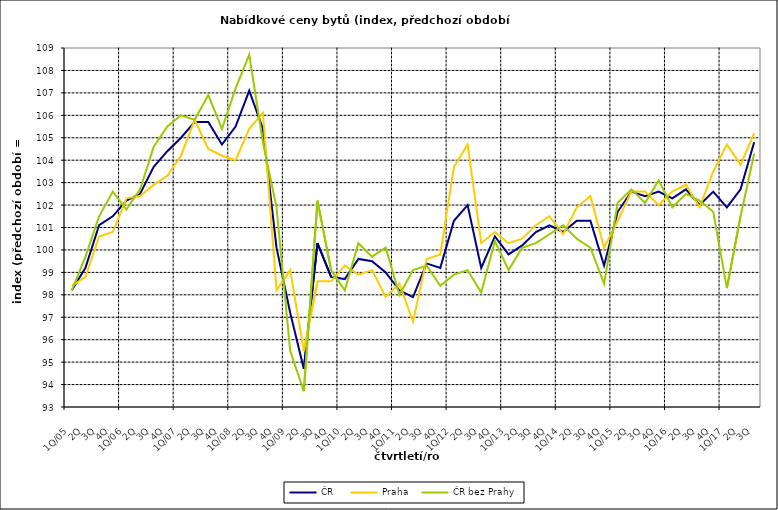
| Category | ČR  | Praha | ČR bez Prahy  |
|---|---|---|---|
| 1Q/05 | 98.2 | 98.4 | 98.2 |
| 2Q | 99.2 | 98.8 | 99.7 |
| 3Q | 101.1 | 100.6 | 101.5 |
| 4Q | 101.5 | 100.8 | 102.6 |
| 1Q/06 | 102.2 | 102.3 | 101.8 |
| 2Q | 102.5 | 102.4 | 102.7 |
| 3Q | 103.7 | 102.9 | 104.6 |
| 4Q | 104.4 | 103.3 | 105.5 |
| 1Q/07 | 105 | 104.2 | 106 |
| 2Q | 105.7 | 105.8 | 105.8 |
| 3Q | 105.7 | 104.5 | 106.9 |
| 4Q | 104.7 | 104.2 | 105.4 |
| 1Q/08 | 105.5 | 104 | 107.2 |
| 2Q | 107.1 | 105.4 | 108.7 |
| 3Q | 105.4 | 106.1 | 104.8 |
| 4Q | 100.1 | 98.2 | 101.9 |
| 1Q/09 | 97.2 | 99.1 | 95.5 |
| 2Q | 94.7 | 95.5 | 93.7 |
| 3Q | 100.3 | 98.6 | 102.2 |
| 4Q | 98.8 | 98.6 | 99.1 |
| 1Q/10 | 98.7 | 99.3 | 98.2 |
| 2Q | 99.6 | 98.9 | 100.3 |
| 3Q | 99.5 | 99.1 | 99.7 |
| 4Q | 99 | 97.9 | 100.1 |
| 1Q/11 | 98.2 | 98.5 | 98 |
| 2Q | 97.9 | 96.8 | 99.1 |
| 3Q | 99.4 | 99.6 | 99.3 |
| 4Q | 99.2 | 99.8 | 98.4 |
| 1Q/12 | 101.3 | 103.7 | 98.9 |
| 2Q | 102 | 104.7 | 99.1 |
| 3Q | 99.2 | 100.3 | 98.1 |
| 4Q | 100.6 | 100.8 | 100.4 |
| 1Q/13 | 99.8 | 100.3 | 99.1 |
| 2Q | 100.2 | 100.5 | 100.1 |
| 3Q | 100.8 | 101.1 | 100.3 |
| 4Q | 101.1 | 101.5 | 100.7 |
| 1Q/14 | 100.8 | 100.7 | 101.1 |
| 2Q | 101.3 | 101.9 | 100.5 |
| 3Q | 101.3 | 102.4 | 100.1 |
| 4Q | 99.3 | 100.1 | 98.5 |
| 1Q/15 | 101.7 | 101.3 | 102.1 |
| 2Q | 102.6 | 102.6 | 102.7 |
| 3Q | 102.4 | 102.6 | 102.1 |
| 4Q | 102.6 | 102 | 103.1 |
| 1Q/16 | 102.3 | 102.6 | 101.9 |
| 2Q | 102.7 | 102.9 | 102.5 |
| 3Q | 102 | 101.9 | 102.2 |
| 4Q | 102.6 | 103.5 | 101.7 |
| 1Q/17 | 101.9 | 104.7 | 98.3 |
| 2Q | 102.7 | 103.8 | 101.5 |
| 3Q | 104.8 | 105.2 | 104.3 |